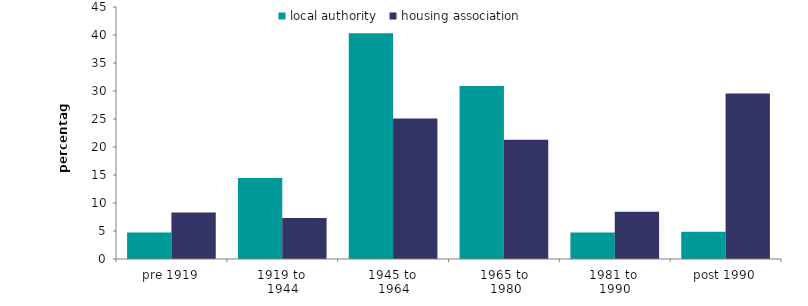
| Category | local authority | housing association |
|---|---|---|
| pre 1919 | 4.721 | 8.288 |
| 1919 to 
1944 | 14.458 | 7.321 |
| 1945 to 
1964 | 40.327 | 25.072 |
| 1965 to
 1980 | 30.899 | 21.307 |
| 1981 to 
1990 | 4.728 | 8.454 |
| post 1990 | 4.867 | 29.558 |